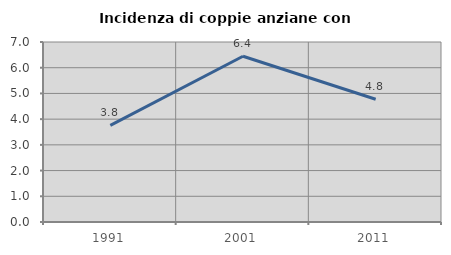
| Category | Incidenza di coppie anziane con figli |
|---|---|
| 1991.0 | 3.757 |
| 2001.0 | 6.444 |
| 2011.0 | 4.775 |